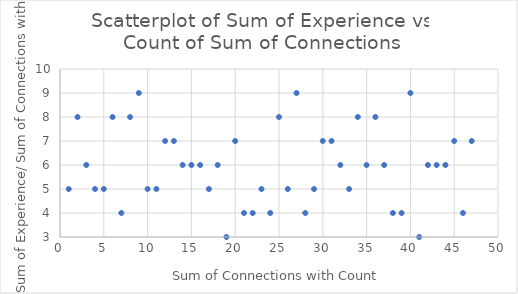
| Category | Series 0 |
|---|---|
| 1.0 | 5 |
| 2.0 | 8 |
| 3.0 | 6 |
| 4.0 | 5 |
| 5.0 | 5 |
| 6.0 | 8 |
| 7.0 | 4 |
| 8.0 | 8 |
| 9.0 | 9 |
| 10.0 | 5 |
| 11.0 | 5 |
| 12.0 | 7 |
| 13.0 | 7 |
| 14.0 | 6 |
| 15.0 | 6 |
| 16.0 | 6 |
| 17.0 | 5 |
| 18.0 | 6 |
| 19.0 | 3 |
| 20.0 | 7 |
| 21.0 | 4 |
| 22.0 | 4 |
| 23.0 | 5 |
| 24.0 | 4 |
| 25.0 | 8 |
| 26.0 | 5 |
| 27.0 | 9 |
| 28.0 | 4 |
| 29.0 | 5 |
| 30.0 | 7 |
| 31.0 | 7 |
| 32.0 | 6 |
| 33.0 | 5 |
| 34.0 | 8 |
| 35.0 | 6 |
| 36.0 | 8 |
| 37.0 | 6 |
| 38.0 | 4 |
| 39.0 | 4 |
| 40.0 | 9 |
| 41.0 | 3 |
| 42.0 | 6 |
| 43.0 | 6 |
| 44.0 | 6 |
| 45.0 | 7 |
| 46.0 | 4 |
| 47.0 | 7 |